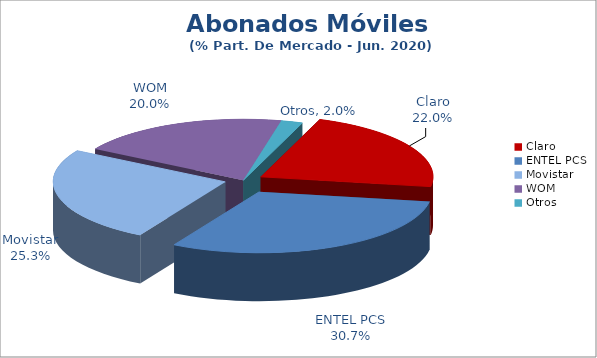
| Category | Series 0 |
|---|---|
| Claro | 0.22 |
| ENTEL PCS | 0.307 |
| Movistar | 0.253 |
| WOM | 0.2 |
| Otros | 0.02 |